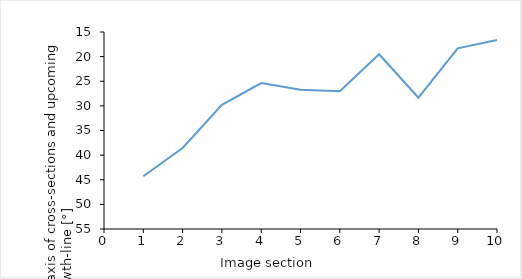
| Category | Series 0 |
|---|---|
| 1.0 | 44.286 |
| 2.0 | 38.542 |
| 3.0 | 29.798 |
| 4.0 | 25.379 |
| 5.0 | 26.733 |
| 6.0 | 27.012 |
| 7.0 | 19.525 |
| 8.0 | 28.338 |
| 9.0 | 18.314 |
| 10.0 | 16.632 |